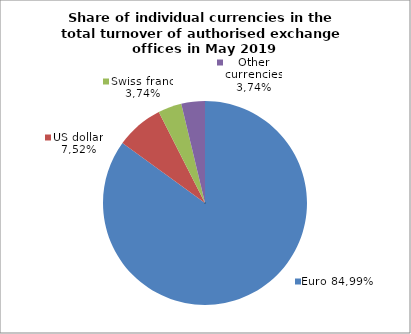
| Category | EUR |
|---|---|
| 0 | 84.991 |
| 1 | 7.524 |
| 2 | 3.742 |
| 3 | 3.742 |